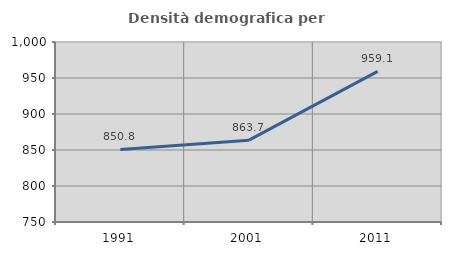
| Category | Densità demografica |
|---|---|
| 1991.0 | 850.77 |
| 2001.0 | 863.679 |
| 2011.0 | 959.143 |